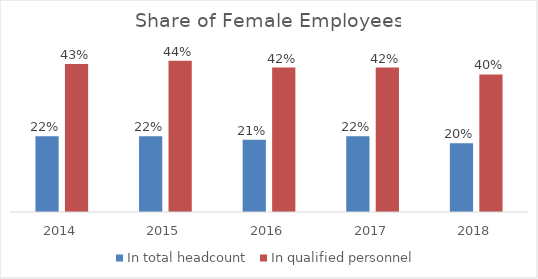
| Category | In total headcount | In qualified personnel |
|---|---|---|
| 2014.0 | 0.22 | 0.43 |
| 2015.0 | 0.22 | 0.44 |
| 2016.0 | 0.21 | 0.42 |
| 2017.0 | 0.22 | 0.42 |
| 2018.0 | 0.2 | 0.4 |